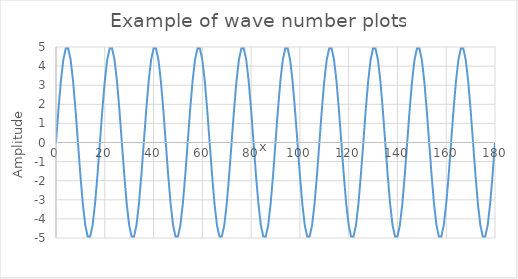
| Category | Series 0 |
|---|---|
| 0.0 | 0 |
| 1.0 | 1.71 |
| 2.0 | 3.214 |
| 3.0 | 4.33 |
| 4.0 | 4.924 |
| 5.0 | 4.924 |
| 6.0 | 4.33 |
| 7.0 | 3.214 |
| 8.0 | 1.71 |
| 9.0 | 0 |
| 10.0 | -1.71 |
| 11.0 | -3.214 |
| 12.0 | -4.33 |
| 13.0 | -4.924 |
| 14.0 | -4.924 |
| 15.0 | -4.33 |
| 16.0 | -3.214 |
| 17.0 | -1.71 |
| 18.0 | 0 |
| 19.0 | 1.71 |
| 20.0 | 3.214 |
| 21.0 | 4.33 |
| 22.0 | 4.924 |
| 23.0 | 4.924 |
| 24.0 | 4.33 |
| 25.0 | 3.214 |
| 26.0 | 1.71 |
| 27.0 | 0 |
| 28.0 | -1.71 |
| 29.0 | -3.214 |
| 30.0 | -4.33 |
| 31.0 | -4.924 |
| 32.0 | -4.924 |
| 33.0 | -4.33 |
| 34.0 | -3.214 |
| 35.0 | -1.71 |
| 36.0 | 0 |
| 37.0 | 1.71 |
| 38.0 | 3.214 |
| 39.0 | 4.33 |
| 40.0 | 4.924 |
| 41.0 | 4.924 |
| 42.0 | 4.33 |
| 43.0 | 3.214 |
| 44.0 | 1.71 |
| 45.0 | 0 |
| 46.0 | -1.71 |
| 47.0 | -3.214 |
| 48.0 | -4.33 |
| 49.0 | -4.924 |
| 50.0 | -4.924 |
| 51.0 | -4.33 |
| 52.0 | -3.214 |
| 53.0 | -1.71 |
| 54.0 | 0 |
| 55.0 | 1.71 |
| 56.0 | 3.214 |
| 57.0 | 4.33 |
| 58.0 | 4.924 |
| 59.0 | 4.924 |
| 60.0 | 4.33 |
| 61.0 | 3.214 |
| 62.0 | 1.71 |
| 63.0 | 0 |
| 64.0 | -1.71 |
| 65.0 | -3.214 |
| 66.0 | -4.33 |
| 67.0 | -4.924 |
| 68.0 | -4.924 |
| 69.0 | -4.33 |
| 70.0 | -3.214 |
| 71.0 | -1.71 |
| 72.0 | 0 |
| 73.0 | 1.71 |
| 74.0 | 3.214 |
| 75.0 | 4.33 |
| 76.0 | 4.924 |
| 77.0 | 4.924 |
| 78.0 | 4.33 |
| 79.0 | 3.214 |
| 80.0 | 1.71 |
| 81.0 | 0 |
| 82.0 | -1.71 |
| 83.0 | -3.214 |
| 84.0 | -4.33 |
| 85.0 | -4.924 |
| 86.0 | -4.924 |
| 87.0 | -4.33 |
| 88.0 | -3.214 |
| 89.0 | -1.71 |
| 90.0 | 0 |
| 91.0 | 1.71 |
| 92.0 | 3.214 |
| 93.0 | 4.33 |
| 94.0 | 4.924 |
| 95.0 | 4.924 |
| 96.0 | 4.33 |
| 97.0 | 3.214 |
| 98.0 | 1.71 |
| 99.0 | 0 |
| 100.0 | -1.71 |
| 101.0 | -3.214 |
| 102.0 | -4.33 |
| 103.0 | -4.924 |
| 104.0 | -4.924 |
| 105.0 | -4.33 |
| 106.0 | -3.214 |
| 107.0 | -1.71 |
| 108.0 | 0 |
| 109.0 | 1.71 |
| 110.0 | 3.214 |
| 111.0 | 4.33 |
| 112.0 | 4.924 |
| 113.0 | 4.924 |
| 114.0 | 4.33 |
| 115.0 | 3.214 |
| 116.0 | 1.71 |
| 117.0 | 0 |
| 118.0 | -1.71 |
| 119.0 | -3.214 |
| 120.0 | -4.33 |
| 121.0 | -4.924 |
| 122.0 | -4.924 |
| 123.0 | -4.33 |
| 124.0 | -3.214 |
| 125.0 | -1.71 |
| 126.0 | 0 |
| 127.0 | 1.71 |
| 128.0 | 3.214 |
| 129.0 | 4.33 |
| 130.0 | 4.924 |
| 131.0 | 4.924 |
| 132.0 | 4.33 |
| 133.0 | 3.214 |
| 134.0 | 1.71 |
| 135.0 | 0 |
| 136.0 | -1.71 |
| 137.0 | -3.214 |
| 138.0 | -4.33 |
| 139.0 | -4.924 |
| 140.0 | -4.924 |
| 141.0 | -4.33 |
| 142.0 | -3.214 |
| 143.0 | -1.71 |
| 144.0 | 0 |
| 145.0 | 1.71 |
| 146.0 | 3.214 |
| 147.0 | 4.33 |
| 148.0 | 4.924 |
| 149.0 | 4.924 |
| 150.0 | 4.33 |
| 151.0 | 3.214 |
| 152.0 | 1.71 |
| 153.0 | 0 |
| 154.0 | -1.71 |
| 155.0 | -3.214 |
| 156.0 | -4.33 |
| 157.0 | -4.924 |
| 158.0 | -4.924 |
| 159.0 | -4.33 |
| 160.0 | -3.214 |
| 161.0 | -1.71 |
| 162.0 | 0 |
| 163.0 | 1.71 |
| 164.0 | 3.214 |
| 165.0 | 4.33 |
| 166.0 | 4.924 |
| 167.0 | 4.924 |
| 168.0 | 4.33 |
| 169.0 | 3.214 |
| 170.0 | 1.71 |
| 171.0 | 0 |
| 172.0 | -1.71 |
| 173.0 | -3.214 |
| 174.0 | -4.33 |
| 175.0 | -4.924 |
| 176.0 | -4.924 |
| 177.0 | -4.33 |
| 178.0 | -3.214 |
| 179.0 | -1.71 |
| 180.0 | 0 |